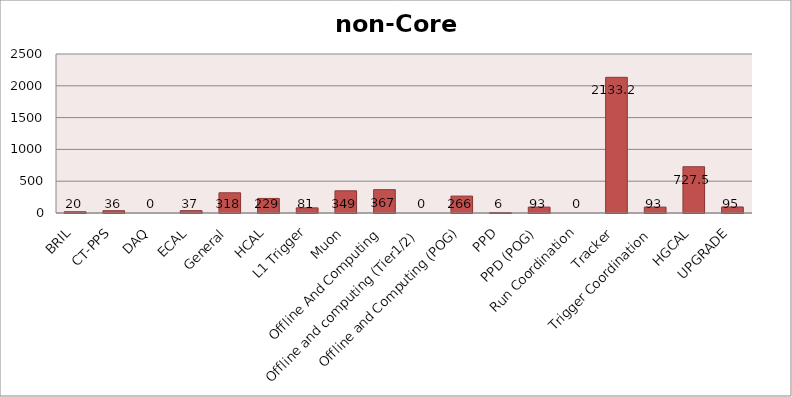
| Category | Series 0 |
|---|---|
| BRIL | 20 |
| CT-PPS | 36 |
| DAQ | 0 |
| ECAL | 37 |
| General | 318 |
| HCAL | 229 |
| L1 Trigger | 81 |
| Muon | 349 |
| Offline And Computing | 367 |
| Offline and computing (Tier1/2) | 0 |
| Offline and Computing (POG) | 266 |
| PPD | 6 |
| PPD (POG) | 93 |
| Run Coordination | 0 |
| Tracker | 2133.2 |
| Trigger Coordination | 93 |
| HGCAL | 727.5 |
| UPGRADE | 95 |